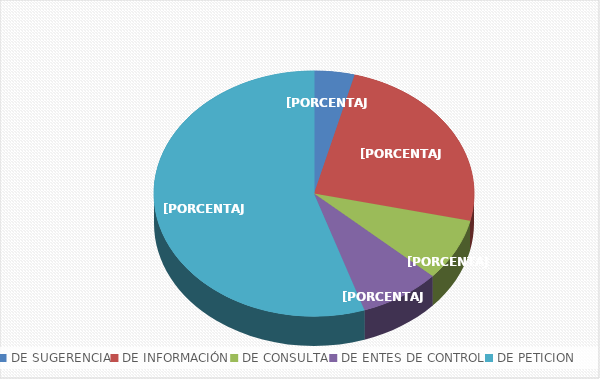
| Category | Series 0 |
|---|---|
| DE SUGERENCIA | 2 |
| DE INFORMACIÓN | 12 |
| DE CONSULTA | 4 |
| DE ENTES DE CONTROL | 4 |
| DE PETICION | 27 |